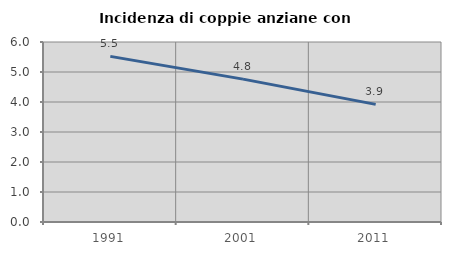
| Category | Incidenza di coppie anziane con figli |
|---|---|
| 1991.0 | 5.521 |
| 2001.0 | 4.762 |
| 2011.0 | 3.922 |